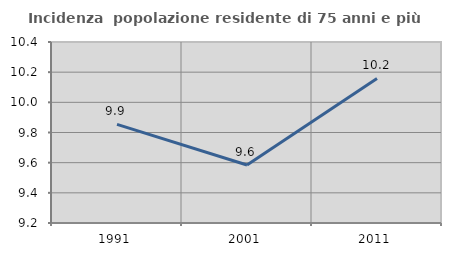
| Category | Incidenza  popolazione residente di 75 anni e più |
|---|---|
| 1991.0 | 9.854 |
| 2001.0 | 9.585 |
| 2011.0 | 10.159 |